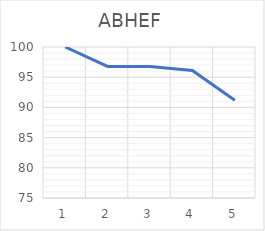
| Category | Series 0 |
|---|---|
| 0 | 100 |
| 1 | 96.775 |
| 2 | 96.767 |
| 3 | 96.107 |
| 4 | 91.196 |